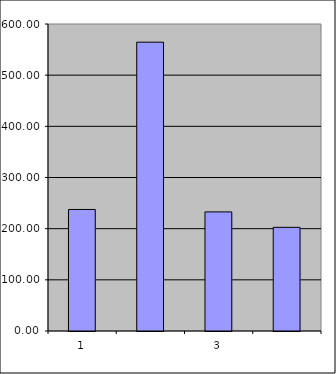
| Category | Series 0 |
|---|---|
| 0 | 237.5 |
| 1 | 564.463 |
| 2 | 232.771 |
| 3 | 202.615 |